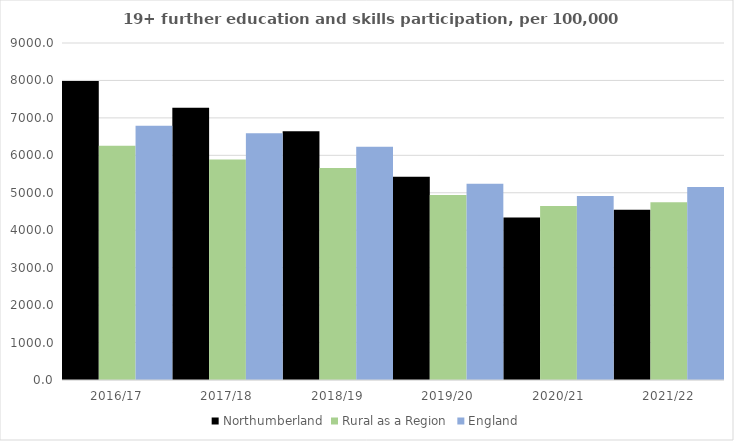
| Category | Northumberland | Rural as a Region | England |
|---|---|---|---|
| 2016/17 | 7987 | 6253.401 | 6788 |
| 2017/18 | 7268 | 5892.029 | 6588 |
| 2018/19 | 6644 | 5661.873 | 6227 |
| 2019/20 | 5430 | 4943.801 | 5244 |
| 2020/21 | 4343 | 4646.727 | 4913 |
| 2021/22 | 4546 | 4747.049 | 5151 |